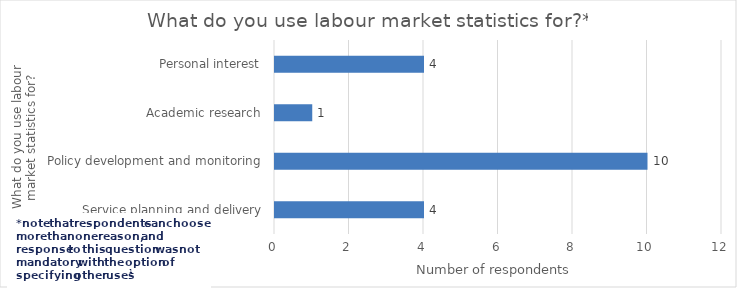
| Category | Series 0 |
|---|---|
| 0 | 4 |
| 1 | 10 |
| 2 | 1 |
| 3 | 4 |